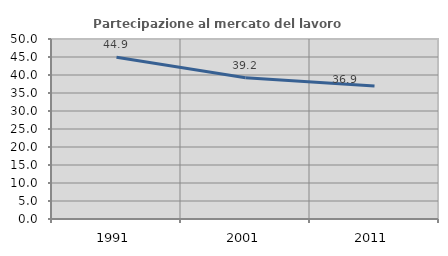
| Category | Partecipazione al mercato del lavoro  femminile |
|---|---|
| 1991.0 | 44.927 |
| 2001.0 | 39.216 |
| 2011.0 | 36.932 |